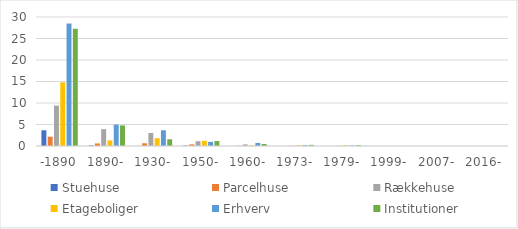
| Category | Stuehuse | Parcelhuse | Rækkehuse | Etageboliger | Erhverv | Institutioner |
|---|---|---|---|---|---|---|
| -1890 | 3.661 | 2.164 | 9.384 | 14.8 | 28.481 | 27.263 |
| 1890- | 0.138 | 0.594 | 3.915 | 1.296 | 4.974 | 4.789 |
| 1930- | 0.009 | 0.636 | 3.032 | 1.811 | 3.655 | 1.565 |
| 1950- | 0.112 | 0.381 | 1.109 | 1.204 | 0.963 | 1.153 |
| 1960- | 0 | 0.054 | 0.374 | 0.179 | 0.713 | 0.474 |
| 1973- | 0 | 0.016 | 0.052 | 0.187 | 0.218 | 0.263 |
| 1979- | 0 | 0.022 | 0.038 | 0.147 | 0.119 | 0.196 |
| 1999- | 0 | 0.005 | 0.002 | 0.009 | 0 | 0 |
| 2007- | 0 | 0.006 | 0 | 0 | 0 | 0 |
| 2016- | 0 | 0 | 0 | 0 | 0 | 0 |